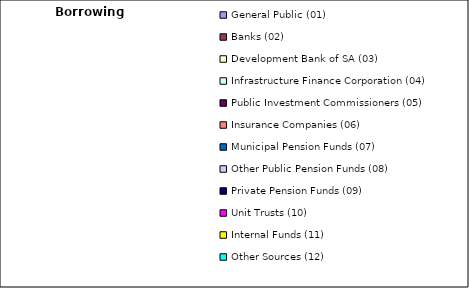
| Category | Borrowing Source |
|---|---|
| General Public (01) | 0 |
| Banks (02) | 0 |
| Development Bank of SA (03) | 0 |
| Infrastructure Finance Corporation (04) | 0 |
| Public Investment Commissioners (05) | 0 |
| Insurance Companies (06) | 0 |
| Municipal Pension Funds (07) | 0 |
| Other Public Pension Funds (08) | 0 |
| Private Pension Funds (09) | 0 |
| Unit Trusts (10) | 0 |
| Internal Funds (11) | 0 |
| Other Sources (12) | 0 |